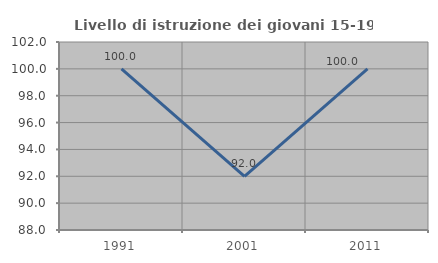
| Category | Livello di istruzione dei giovani 15-19 anni |
|---|---|
| 1991.0 | 100 |
| 2001.0 | 92 |
| 2011.0 | 100 |